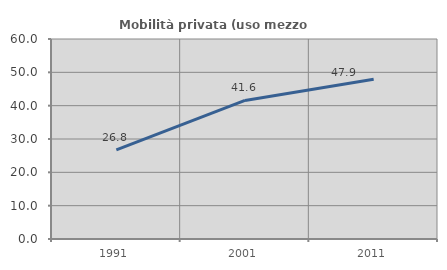
| Category | Mobilità privata (uso mezzo privato) |
|---|---|
| 1991.0 | 26.752 |
| 2001.0 | 41.573 |
| 2011.0 | 47.927 |